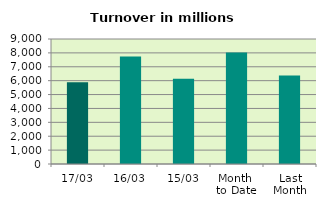
| Category | Series 0 |
|---|---|
| 17/03 | 5886.225 |
| 16/03 | 7731.832 |
| 15/03 | 6137.984 |
| Month 
to Date | 8020.821 |
| Last
Month | 6378.947 |